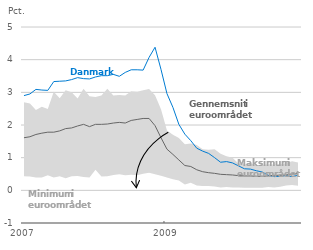
| Category | Min. i
euroområdet | Maks. i
euroområdet | DK
 | Gennemsnit i 
euroområdet |
|---|---|---|---|---|
| 2007-01-01 | 0.43 | 2.7 | 2.9 | 1.61 |
| 2007-02-01 | 0.42 | 2.66 | 2.95 | 1.64 |
| 2007-03-01 | 0.39 | 2.46 | 3.09 | 1.71 |
| 2007-04-01 | 0.39 | 2.56 | 3.07 | 1.75 |
| 2007-05-01 | 0.46 | 2.49 | 3.06 | 1.78 |
| 2007-06-01 | 0.39 | 3.02 | 3.33 | 1.78 |
| 2007-07-01 | 0.43 | 2.82 | 3.34 | 1.82 |
| 2007-08-01 | 0.37 | 3.06 | 3.35 | 1.89 |
| 2007-09-01 | 0.43 | 3 | 3.39 | 1.91 |
| 2007-10-01 | 0.44 | 2.81 | 3.45 | 1.97 |
| 2007-11-01 | 0.41 | 3.11 | 3.42 | 2.02 |
| 2007-12-01 | 0.39 | 2.88 | 3.41 | 1.95 |
| 2008-01-01 | 0.63 | 2.86 | 3.47 | 2.02 |
| 2008-02-01 | 0.42 | 2.9 | 3.51 | 2.02 |
| 2008-03-01 | 0.43 | 3.11 | 3.51 | 2.03 |
| 2008-04-01 | 0.47 | 2.9 | 3.55 | 2.06 |
| 2008-05-01 | 0.49 | 2.92 | 3.49 | 2.08 |
| 2008-06-01 | 0.46 | 2.9 | 3.61 | 2.06 |
| 2008-07-01 | 0.48 | 3.03 | 3.69 | 2.14 |
| 2008-08-01 | 0.46 | 3.02 | 3.69 | 2.17 |
| 2008-09-01 | 0.51 | 3.06 | 3.68 | 2.2 |
| 2008-10-01 | 0.54 | 3.1 | 4.07 | 2.2 |
| 2008-11-01 | 0.49 | 2.91 | 4.38 | 1.98 |
| 2008-12-01 | 0.45 | 2.48 | 3.7 | 1.61 |
| 2009-01-01 | 0.39 | 1.83 | 2.96 | 1.26 |
| 2009-02-01 | 0.34 | 1.7 | 2.54 | 1.1 |
| 2009-03-01 | 0.3 | 1.6 | 2.02 | 0.93 |
| 2009-04-01 | 0.18 | 1.41 | 1.72 | 0.76 |
| 2009-05-01 | 0.23 | 1.43 | 1.52 | 0.73 |
| 2009-06-01 | 0.15 | 1.39 | 1.29 | 0.63 |
| 2009-07-01 | 0.13 | 1.26 | 1.2 | 0.57 |
| 2009-08-01 | 0.13 | 1.24 | 1.13 | 0.54 |
| 2009-09-01 | 0.12 | 1.26 | 1 | 0.52 |
| 2009-10-01 | 0.09 | 1.12 | 0.86 | 0.49 |
| 2009-11-01 | 0.1 | 1.04 | 0.88 | 0.48 |
| 2009-12-01 | 0.09 | 1 | 0.84 | 0.47 |
| 2010-01-01 | 0.09 | 0.82 | 0.75 | 0.45 |
| 2010-02-01 | 0.08 | 0.79 | 0.66 | 0.44 |
| 2010-03-01 | 0.08 | 0.83 | 0.65 | 0.44 |
| 2010-04-01 | 0.08 | 0.77 | 0.6 | 0.43 |
| 2010-05-01 | 0.08 | 0.78 | 0.56 | 0.43 |
| 2010-06-01 | 0.1 | 0.8 | 0.46 | 0.44 |
| 2010-07-01 | 0.09 | 0.79 | 0.42 | 0.46 |
| 2010-08-01 | 0.11 | 0.79 | 0.43 | 0.46 |
| 2010-09-01 | 0.15 | 0.84 | 0.45 | 0.47 |
| 2010-10-01 | 0.16 | 0.89 | 0.42 | 0.5 |
| 2010-11-01 | 0.14 | 0.85 | 0.46 | 0.51 |
| 2010-12-01 | 0.11 | 0.83 | 0.47 | 0.51 |
| 2011-01-01 | 0.18 | 1 | 0.46 | 0.55 |
| 2011-02-01 | 0.16 | 0.91 | 0.47 | 0.53 |
| 2011-03-01 | 0.18 | 0.94 | 0.48 | 0.55 |
| 2011-04-01 | 0.18 | 1.11 | 0.58 | 0.62 |
| 2011-05-01 | 0.21 | 1.06 | 0.62 | 0.64 |
| 2011-06-01 | 0.24 | 1.18 | 0.65 | 0.68 |
| 2011-07-01 | 0.19 | 1.09 | 0.7 | 0.67 |
| 2011-08-01 | 0.19 | 1.09 | 0.73 | 0.69 |
| 2011-09-01 | 0.23 | 1.1 | 0.7 | 0.7 |
| 2011-10-01 | 0.17 | 1.11 | 0.69 | 0.7 |
| 2011-11-01 | 0.16 | 1.16 | 0.52 | 0.67 |
| 2011-12-01 | 0.13 | 1.21 | 0.43 | 0.66 |
| 2012-01-01 | 0.11 | 1.12 | 0.38 | 0.62 |
| 2012-02-01 | 0.11 | 1.11 | 0.35 | 0.61 |
| 2012-03-01 | 0.12 | 1.08 | 0.36 | 0.59 |
| 2012-04-01 | 0.12 | 1.04 | 0.31 | 0.56 |
| 2012-05-01 | 0.12 | 1.03 | 0.31 | 0.55 |
| 2012-06-01 | 0.08 | 0.98 | 0.3 | 0.53 |
| 2012-07-01 | 0.09 | 0.97 | 0.26 | 0.49 |
| 2012-08-01 | 0.07 | 1.01 | 0.24 | 0.47 |
| 2012-09-01 | 0.07 | 1.09 | 0.24 | 0.47 |
| 2012-10-01 | 0.05 | 1.13 | 0.23 | 0.46 |
| 2012-11-01 | 0.05 | 1.11 | 0.23 | 0.44 |
| 2012-12-01 | 0.05 | 1.09 | 0.24 | 0.42 |
| 2013-01-01 | 0.05 | 1 | 0.22 | 0.4 |
| 2013-02-01 | 0.05 | 1 | 0.23 | 0.4 |
| 2013-03-01 | 0.05 | 1.03 | 0.24 | 0.4 |
| 2013-04-01 | 0.05 | 0.98 | 0.22 | 0.39 |
| 2013-05-01 | 0.05 | 0.97 | 0.23 | 0.39 |
| 2013-06-01 | 0.05 | 0.94 | 0.27 | 0.38 |
| 2013-07-01 | 0.05 | 0.95 | 0.27 | 0.37 |
| 2013-08-01 | 0.05 | 0.95 | 0.23 | 0.37 |
| 2013-09-01 | 0.05 | 0.83 | 0.24 | 0.35 |
| 2013-10-01 | 0.05 | 0.78 | 0.2 | 0.34 |
| 2013-11-01 | 0.05 | 0.77 | 0.22 | 0.34 |
| 2013-12-01 | 0.05 | 0.77 | 0.23 | 0.34 |
| 2014-01-01 | 0.04 | 0.74 | 0.23 | 0.33 |
| 2014-02-01 | 0.06 | 0.72 | 0.23 | 0.33 |
| 2014-03-01 | 0.05 | 0.76 | 0.22 | 0.35 |
| 2014-04-01 | 0.05 | 0.72 | 0.2 | 0.34 |
| 2014-05-01 | 0.05 | 0.68 | 0.2 | 0.34 |
| 2014-06-01 | 0.04 | 0.65 | 0.22 | 0.31 |
| 2014-07-01 | 0.04 | 0.57 | 0.21 | 0.28 |
| 2014-08-01 | 0.04 | 0.56 | 0.22 | 0.28 |
| 2014-09-01 | 0.04 | 0.53 | 0.19 | 0.26 |
| 2014-10-01 | 0.03 | 0.47 | 0.2 | 0.24 |
| 2014-11-01 | 0.03 | 0.43 | 0.19 | 0.24 |
| 2014-12-01 | 0.03 | 0.47 | 0.2 | 0.24 |
| 2015-01-01 | 0.02 | 0.41 | 0.17 | 0.23 |
| 2015-02-01 | 0.02 | 0.38 | 0.13 | 0.22 |
| 2015-03-01 | 0.02 | 0.37 | 0.03 | 0.22 |
| 2015-04-01 | 0.02 | 0.34 | -0.05 | 0.19 |
| 2015-05-01 | 0.02 | 0.31 | -0.03 | 0.19 |
| 2015-06-01 | 0.02 | 0.31 | -0.05 | 0.19 |
| 2015-07-01 | 0.02 | 0.29 | -0.06 | 0.18 |
| 2015-08-01 | 0.02 | 0.29 | -0.06 | 0.18 |
| 2015-09-01 | 0.01 | 0.28 | -0.04 | 0.17 |
| 2015-10-01 | 0.02 | 0.29 | -0.03 | 0.17 |
| 2015-11-01 | 0.01 | 0.29 | -0.05 | 0.16 |
| 2015-12-01 | 0.01 | 0.24 | -0.05 | 0.15 |
| 2016-01-01 | 0.02 | 0.26 | -0.06 | 0.13 |
| 2016-02-01 | 0.01 | 0.24 | -0.07 | 0.13 |
| 2016-03-01 | 0.01 | 0.29 | -0.05 | 0.14 |
| 2016-04-01 | 0.01 | 0.25 | -0.06 | 0.12 |
| 2016-05-01 | -0.01 | 0.25 | -0.06 | 0.11 |
| 2016-06-01 | 0.01 | 0.24 | -0.06 | 0.11 |
| 2016-07-01 | 0.01 | 0.23 | -0.09 | 0.1 |
| 2016-08-01 | 0.01 | 0.2 | -0.09 | 0.09 |
| 2016-09-01 | 0 | 0.22 | -0.09 | 0.09 |
| 2016-10-01 | 0 | 0.21 | -0.09 | 0.08 |
| 2016-11-01 | 0 | 0.21 | -0.11 | 0.07 |
| 2016-12-01 | -0.07 | 0.15 | -0.14 | 0.06 |
| 2017-01-01 | -0.08 | 0.16 | -0.18 | 0.06 |
| 2017-02-01 | -0.07 | 0.15 | -0.19 | 0.05 |
| 2017-03-01 | -0.07 | 0.18 | -0.18 | 0.05 |
| 2017-04-01 | -0.07 | 0.16 | -0.17 | 0.05 |
| 2017-05-01 | -0.07 | 0.15 | -0.18 | 0.05 |
| 2017-06-01 | -0.08 | 0.14 | -0.18 | 0.04 |
| 2017-07-01 | -0.08 | 0.14 | -0.2 | 0.04 |
| 2017-08-01 | -0.08 | 0.14 | -0.21 | 0.04 |
| 2017-09-01 | -0.09 | 0.13 | -0.21 | 0.04 |
| 2017-10-01 | -0.08 | 0.17 | -0.22 | 0.04 |
| 2017-11-01 | -0.07 | 0.17 | -0.23 | 0.04 |
| 2017-12-01 | -0.08 | 0.16 | -0.24 | 0.04 |
| 2018-01-01 | -0.08 | 0.16 | -0.26 | 0.04 |
| 2018-02-01 | -0.06 | 0.15 | -0.27 | 0.04 |
| 2018-03-01 | -0.07 | 0.14 | -0.26 | 0.04 |
| 2018-04-01 | -0.06 | 0.17 | -0.26 | 0.04 |
| 2018-05-01 | -0.05 | 0.16 | -0.27 | 0.03 |
| 2018-06-01 | -0.05 | 0.14 | -0.29 | 0.04 |
| 2018-07-01 | -0.05 | 0.14 | -0.29 | 0.03 |
| 2018-08-01 | -0.04 | 0.14 | -0.3 | 0.03 |
| 2018-09-01 | -0.06 | 0.15 | -0.29 | 0.03 |
| 2018-10-01 | -0.06 | 0.16 | -0.3 | 0.03 |
| 2018-11-01 | -0.06 | 0.16 | -0.3 | 0.03 |
| 2018-12-01 | -0.08 | 0.14 | -0.29 | 0.03 |
| 2019-01-01 | -0.08 | 0.14 | -0.3 | 0.03 |